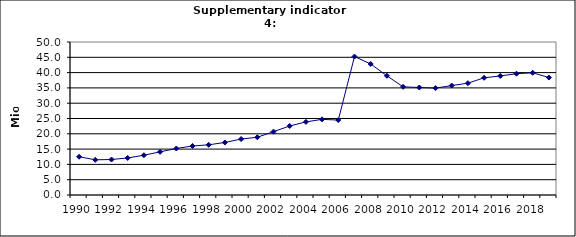
| Category | Domestic air-passengers, Mio |
|---|---|
| 1990 | 12.5 |
| 1991 | 11.5 |
| 1992 | 11.6 |
| 1993 | 12.1 |
| 1994 | 13 |
| 1995 | 14.1 |
| 1996 | 15.2 |
| 1997 | 16.013 |
| 1998 | 16.4 |
| 1999 | 17.17 |
| 2000 | 18.283 |
| 2001 | 18.867 |
| 2002 | 20.696 |
| 2003 | 22.553 |
| 2004 | 23.89 |
| 2005 | 24.719 |
| 2006 | 24.491 |
| 2007 | 45.256 |
| 2008 | 42.812 |
| 2009 | 38.953 |
| 2010 | 35.351 |
| 2011 | 35.132 |
| 2012 | 34.935 |
| 2013 | 35.761 |
| 2014 | 36.543 |
| 2015 | 38.307 |
| 2016 | 38.904 |
| 2017 | 39.637 |
| 2018 | 39.951 |
| 2019 | 38.381 |